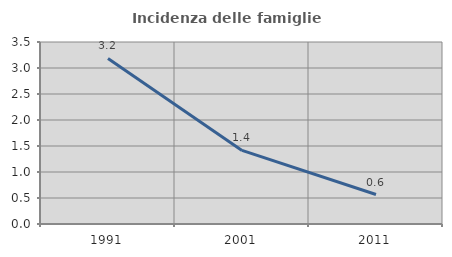
| Category | Incidenza delle famiglie numerose |
|---|---|
| 1991.0 | 3.184 |
| 2001.0 | 1.415 |
| 2011.0 | 0.567 |